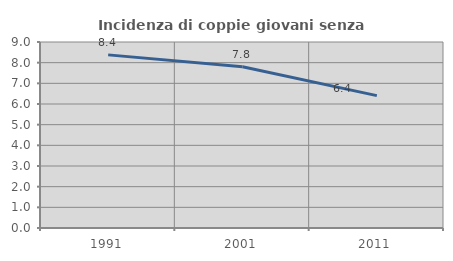
| Category | Incidenza di coppie giovani senza figli |
|---|---|
| 1991.0 | 8.377 |
| 2001.0 | 7.801 |
| 2011.0 | 6.404 |